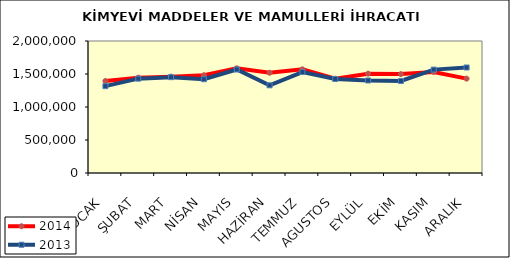
| Category | 2014 | 2013 |
|---|---|---|
| OCAK | 1394170.434 | 1315959.693 |
| ŞUBAT | 1444414.474 | 1429457.66 |
| MART | 1460149.298 | 1452101.21 |
| NİSAN | 1481233.621 | 1420968.311 |
| MAYIS | 1586184.855 | 1568761.093 |
| HAZİRAN | 1519097.927 | 1328721.923 |
| TEMMUZ | 1570520.72 | 1529671.388 |
| AGUSTOS | 1427929.036 | 1424471.588 |
| EYLÜL | 1504452.233 | 1401853.679 |
| EKİM | 1498198.027 | 1394136.465 |
| KASIM | 1531071.334 | 1566545.006 |
| ARALIK | 1429708.607 | 1598637.717 |